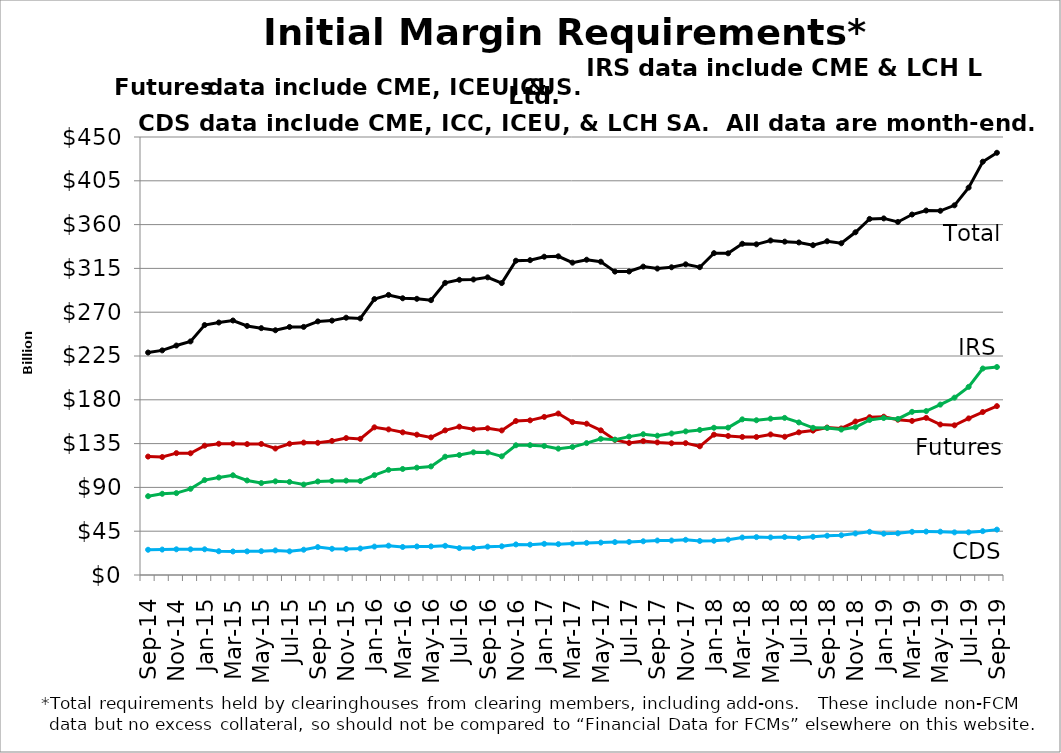
| Category | CDS | Futures | IRS | Total |
|---|---|---|---|---|
| 2014-09-30 |  |  |  |  |
| nan |  |  |  |  |
| 2014-11-28 |  |  |  |  |
| nan |  |  |  |  |
| 2015-01-30 |  |  |  |  |
| nan |  |  |  |  |
| 2015-03-31 |  |  |  |  |
| nan |  |  |  |  |
| 2015-05-29 |  |  |  |  |
| nan |  |  |  |  |
| 2015-07-31 |  |  |  |  |
| nan |  |  |  |  |
| 2015-09-30 |  |  |  |  |
| nan |  |  |  |  |
| 2015-11-30 |  |  |  |  |
| nan |  |  |  |  |
| 2016-01-29 |  |  |  |  |
| nan |  |  |  |  |
| 2016-03-31 |  |  |  |  |
| nan |  |  |  |  |
| 2016-05-31 |  |  |  |  |
| nan |  |  |  |  |
| 2016-07-29 |  |  |  |  |
| nan |  |  |  |  |
| 2016-09-30 |  |  |  |  |
| nan |  |  |  |  |
| 2016-11-30 |  |  |  |  |
| nan |  |  |  |  |
| 2017-01-31 |  |  |  |  |
| nan |  |  |  |  |
| 2017-03-31 |  |  |  |  |
| nan |  |  |  |  |
| 2017-05-31 |  |  |  |  |
| nan |  |  |  |  |
| 2017-07-31 |  |  |  |  |
| nan |  |  |  |  |
| 2017-09-29 |  |  |  |  |
| nan |  |  |  |  |
| 2017-11-30 |  |  |  |  |
| nan |  |  |  |  |
| 2018-01-31 |  |  |  |  |
| nan |  |  |  |  |
| 2018-03-29 |  |  |  |  |
| nan |  |  |  |  |
| 2018-05-31 |  |  |  |  |
| nan |  |  |  |  |
| 2018-07-31 |  |  |  |  |
| nan |  |  |  |  |
| 2018-09-28 |  |  |  |  |
| nan |  |  |  |  |
| 2018-11-30 |  |  |  |  |
| nan |  |  |  |  |
| 2019-01-31 |  |  |  |  |
| nan |  |  |  |  |
| 2019-03-29 |  |  |  |  |
| nan |  |  |  |  |
| 2019-05-31 |  |  |  |  |
| nan |  |  |  |  |
| 2019-07-31 |  |  |  |  |
| nan |  |  |  |  |
| 2019-09-30 |  |  |  |  |